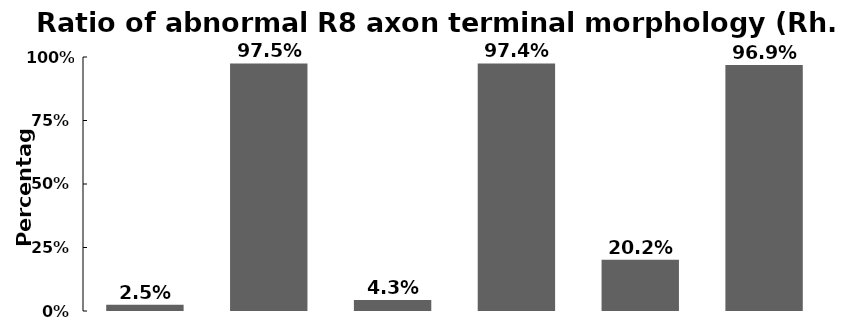
| Category | Series 0 |
|---|---|
| WT
(n=5, 407 axons) | 0.025 |
| gogo-
(n=5, 354) | 0.975 |
| gogo- 
+Gogo
(n=5, 490) | 0.043 |
| gogo- 
+GogoΔC
(n=5, 430) | 0.974 |
| gogo- 
+GogoFFD
(n=5, 391) | 0.202 |
| gogo-
+GogoDDD
(n=5, 449) | 0.969 |